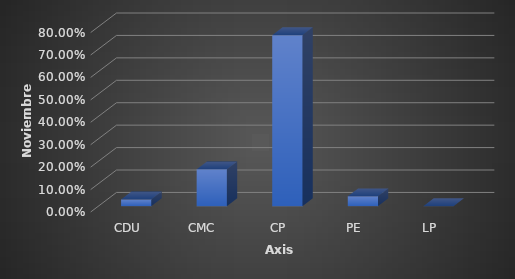
| Category | Series 0 |
|---|---|
| CDU | 0.03 |
| CMC | 0.164 |
| CP | 0.762 |
| PE | 0.044 |
| LP | 0 |